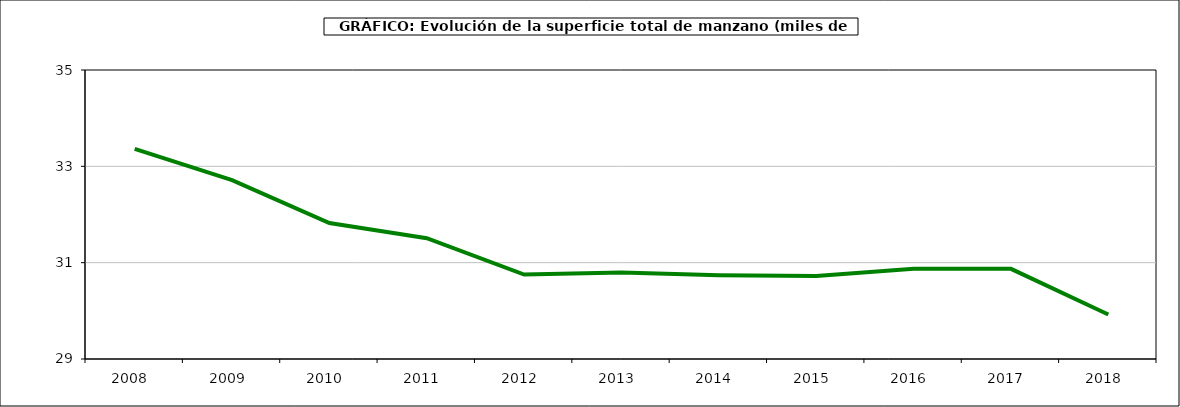
| Category | superficie manzano |
|---|---|
| 2008.0 | 33.362 |
| 2009.0 | 32.715 |
| 2010.0 | 31.822 |
| 2011.0 | 31.507 |
| 2012.0 | 30.753 |
| 2013.0 | 30.794 |
| 2014.0 | 30.739 |
| 2015.0 | 30.721 |
| 2016.0 | 30.872 |
| 2017.0 | 30.872 |
| 2018.0 | 29.925 |